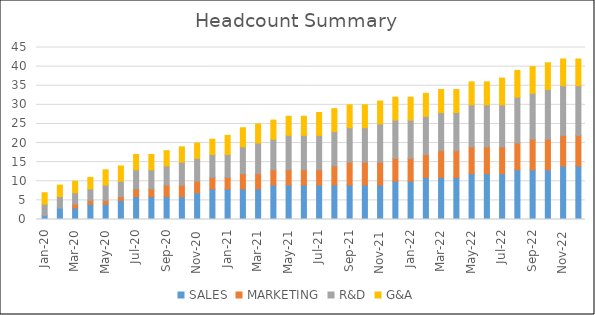
| Category | SALES | MARKETING | R&D | G&A |
|---|---|---|---|---|
| 2020-01-01 | 1 | 0 | 3 | 3 |
| 2020-02-29 | 3 | 0 | 3 | 3 |
| 2020-03-31 | 3 | 1 | 3 | 3 |
| 2020-04-30 | 4 | 1 | 3 | 3 |
| 2020-05-31 | 4 | 1 | 4 | 4 |
| 2020-06-30 | 5 | 1 | 4 | 4 |
| 2020-07-31 | 6 | 2 | 5 | 4 |
| 2020-08-31 | 6 | 2 | 5 | 4 |
| 2020-09-30 | 6 | 3 | 5 | 4 |
| 2020-10-31 | 6 | 3 | 6 | 4 |
| 2020-11-30 | 7 | 3 | 6 | 4 |
| 2020-12-31 | 8 | 3 | 6 | 4 |
| 2021-01-31 | 8 | 3 | 6 | 5 |
| 2021-02-28 | 8 | 4 | 7 | 5 |
| 2021-03-31 | 8 | 4 | 8 | 5 |
| 2021-04-30 | 9 | 4 | 8 | 5 |
| 2021-05-31 | 9 | 4 | 9 | 5 |
| 2021-06-30 | 9 | 4 | 9 | 5 |
| 2021-07-31 | 9 | 4 | 9 | 6 |
| 2021-08-31 | 9 | 5 | 9 | 6 |
| 2021-09-30 | 9 | 6 | 9 | 6 |
| 2021-10-31 | 9 | 6 | 9 | 6 |
| 2021-11-30 | 9 | 6 | 10 | 6 |
| 2021-12-31 | 10 | 6 | 10 | 6 |
| 2022-01-31 | 10 | 6 | 10 | 6 |
| 2022-02-28 | 11 | 6 | 10 | 6 |
| 2022-03-31 | 11 | 7 | 10 | 6 |
| 2022-04-30 | 11 | 7 | 10 | 6 |
| 2022-05-31 | 12 | 7 | 11 | 6 |
| 2022-06-30 | 12 | 7 | 11 | 6 |
| 2022-07-31 | 12 | 7 | 11 | 7 |
| 2022-08-31 | 13 | 7 | 12 | 7 |
| 2022-09-30 | 13 | 8 | 12 | 7 |
| 2022-10-31 | 13 | 8 | 13 | 7 |
| 2022-11-30 | 14 | 8 | 13 | 7 |
| 2022-12-31 | 14 | 8 | 13 | 7 |